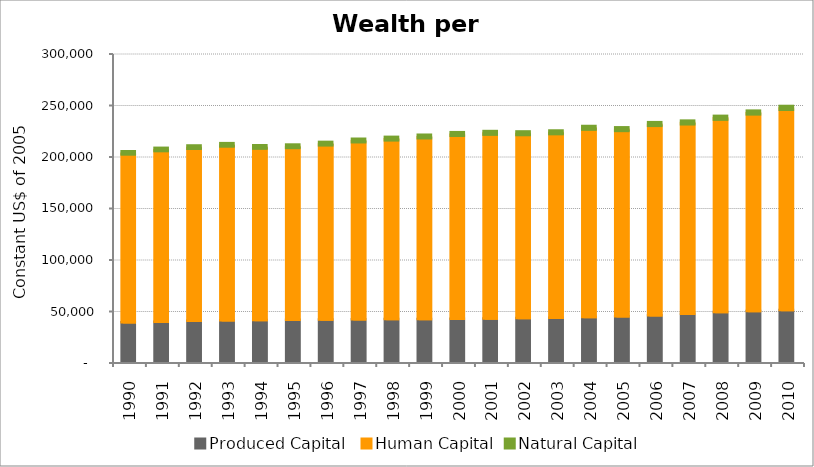
| Category | Produced Capital  | Human Capital | Natural Capital |
|---|---|---|---|
| 1990.0 | 38298.694 | 163663.077 | 1726.354 |
| 1991.0 | 38922.409 | 166349.248 | 1693.928 |
| 1992.0 | 39917.006 | 167634.081 | 1660.781 |
| 1993.0 | 40358.301 | 169452.281 | 1627.795 |
| 1994.0 | 40582.729 | 167189.539 | 1569.324 |
| 1995.0 | 40745.11 | 167713.825 | 1534.368 |
| 1996.0 | 41038.075 | 169983.197 | 1514.222 |
| 1997.0 | 41171.29 | 172902.255 | 1483.034 |
| 1998.0 | 41413.702 | 174507.364 | 1468.017 |
| 1999.0 | 41581.837 | 176396.24 | 1443.732 |
| 2000.0 | 41778.522 | 178668.269 | 1412.759 |
| 2001.0 | 41988.46 | 179566.957 | 1384.24 |
| 2002.0 | 42366.612 | 178812.603 | 1361.033 |
| 2003.0 | 42756.442 | 179323.925 | 1376.704 |
| 2004.0 | 43433.246 | 183027.459 | 1353.243 |
| 2005.0 | 44194.08 | 180981.544 | 1357.588 |
| 2006.0 | 45237.796 | 184932.864 | 1319.909 |
| 2007.0 | 46680.946 | 185005.608 | 1284.913 |
| 2008.0 | 48266.432 | 188037.218 | 1206.805 |
| 2009.0 | 49360.168 | 192013.387 | 1220.063 |
| 2010.0 | 50129.363 | 195767.177 | 1181.787 |